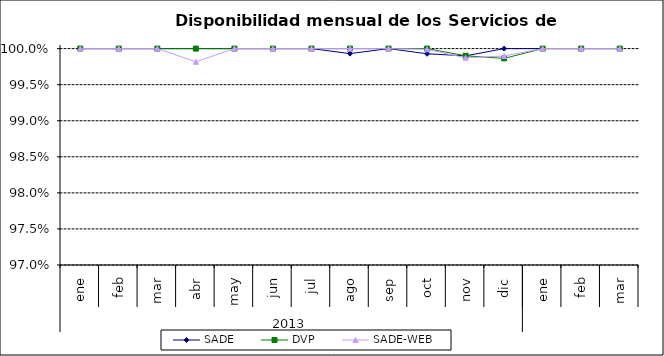
| Category | SADE | DVP | SADE-WEB |
|---|---|---|---|
| 0 | 1 | 1 | 1 |
| 1 | 1 | 1 | 1 |
| 2 | 1 | 1 | 1 |
| 3 | 1 | 1 | 0.998 |
| 4 | 1 | 1 | 1 |
| 5 | 1 | 1 | 1 |
| 6 | 1 | 1 | 1 |
| 7 | 0.999 | 1 | 1 |
| 8 | 1 | 1 | 1 |
| 9 | 0.999 | 1 | 1 |
| 10 | 0.999 | 0.999 | 0.999 |
| 11 | 1 | 0.999 | 0.999 |
| 12 | 1 | 1 | 1 |
| 13 | 1 | 1 | 1 |
| 14 | 1 | 1 | 1 |